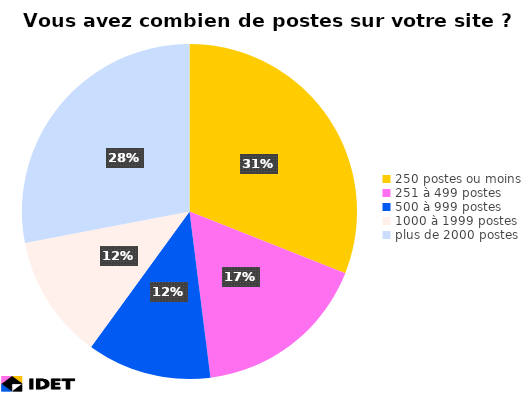
| Category | Series 1 |
|---|---|
| 250 postes ou moins | 31 |
| 251 à 499 postes | 17 |
| 500 à 999 postes | 12 |
| 1000 à 1999 postes | 12 |
| plus de 2000 postes | 28 |